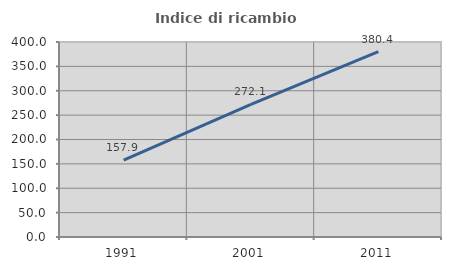
| Category | Indice di ricambio occupazionale  |
|---|---|
| 1991.0 | 157.895 |
| 2001.0 | 272.131 |
| 2011.0 | 380.357 |